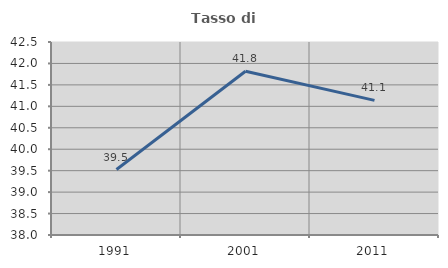
| Category | Tasso di occupazione   |
|---|---|
| 1991.0 | 39.526 |
| 2001.0 | 41.819 |
| 2011.0 | 41.139 |